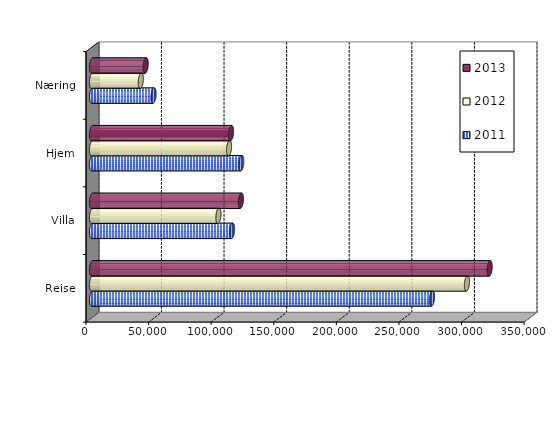
| Category | 2011 | 2012 | 2013 |
|---|---|---|---|
| Reise | 271585.667 | 299510 | 317630 |
| Villa | 111907.64 | 100999 | 118928 |
| Hjem | 119248.229 | 109466 | 111027 |
| Næring | 49158.046 | 38994 | 42880 |